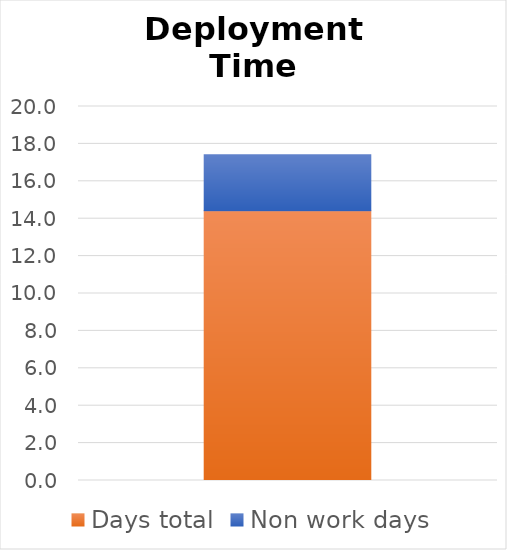
| Category | Days total | Non work days |
|---|---|---|
| 0 | 14.425 | 3 |